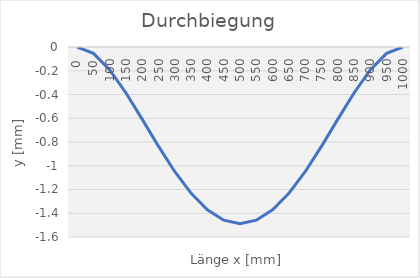
| Category | Series 0 |
|---|---|
| 0.0 | 0 |
| 50.0 | -0.054 |
| 100.0 | -0.193 |
| 150.0 | -0.387 |
| 200.0 | -0.61 |
| 250.0 | -0.837 |
| 300.0 | -1.05 |
| 350.0 | -1.232 |
| 400.0 | -1.371 |
| 450.0 | -1.458 |
| 500.0 | -1.488 |
| 550.0 | -1.458 |
| 600.0 | -1.371 |
| 650.0 | -1.232 |
| 700.0 | -1.05 |
| 750.0 | -0.837 |
| 800.0 | -0.61 |
| 850.0 | -0.387 |
| 900.0 | -0.193 |
| 950.0 | -0.054 |
| 1000.0 | 0 |